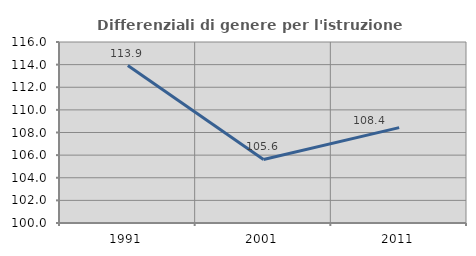
| Category | Differenziali di genere per l'istruzione superiore |
|---|---|
| 1991.0 | 113.92 |
| 2001.0 | 105.619 |
| 2011.0 | 108.432 |